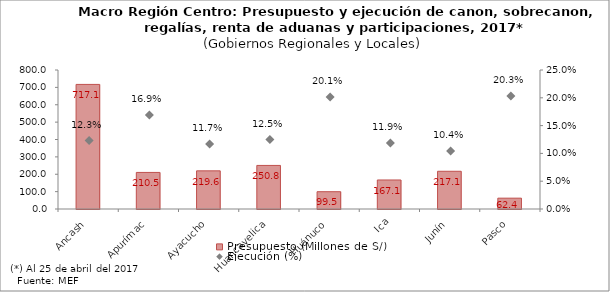
| Category | Presupuesto (Millones de S/) |
|---|---|
| Ancash | 717.073 |
| Apurímac | 210.495 |
| Ayacucho | 219.59 |
| Huancavelica | 250.769 |
| Huánuco | 99.546 |
| Ica | 167.058 |
| Junín | 217.097 |
| Pasco | 62.37 |